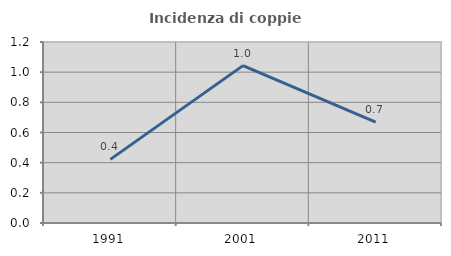
| Category | Incidenza di coppie miste |
|---|---|
| 1991.0 | 0.422 |
| 2001.0 | 1.043 |
| 2011.0 | 0.669 |